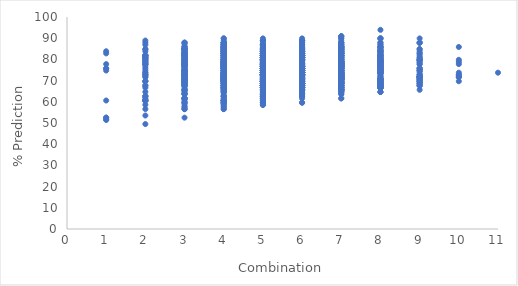
| Category | Series 0 |
|---|---|
| 1.0 | 82.828 |
| 1.0 | 77.778 |
| 1.0 | 75.758 |
| 1.0 | 52.525 |
| 1.0 | 52.525 |
| 1.0 | 51.515 |
| 1.0 | 51.515 |
| 1.0 | 75.758 |
| 1.0 | 60.606 |
| 1.0 | 74.747 |
| 1.0 | 83.838 |
| 2.0 | 80.808 |
| 2.0 | 79.798 |
| 2.0 | 78.788 |
| 2.0 | 77.778 |
| 2.0 | 74.747 |
| 2.0 | 72.727 |
| 2.0 | 69.697 |
| 2.0 | 67.677 |
| 2.0 | 62.626 |
| 2.0 | 60.606 |
| 2.0 | 83.838 |
| 2.0 | 73.737 |
| 2.0 | 66.667 |
| 2.0 | 60.606 |
| 2.0 | 49.495 |
| 2.0 | 79.798 |
| 2.0 | 76.768 |
| 2.0 | 62.626 |
| 2.0 | 56.566 |
| 2.0 | 60.606 |
| 2.0 | 60.606 |
| 2.0 | 88.889 |
| 2.0 | 78.788 |
| 2.0 | 81.818 |
| 2.0 | 77.778 |
| 2.0 | 71.717 |
| 2.0 | 69.697 |
| 2.0 | 75.758 |
| 2.0 | 69.697 |
| 2.0 | 71.717 |
| 2.0 | 64.646 |
| 2.0 | 60.606 |
| 2.0 | 53.535 |
| 2.0 | 58.586 |
| 2.0 | 61.616 |
| 2.0 | 67.677 |
| 2.0 | 80.808 |
| 2.0 | 81.818 |
| 2.0 | 78.788 |
| 2.0 | 80.808 |
| 2.0 | 72.727 |
| 2.0 | 77.778 |
| 2.0 | 77.778 |
| 2.0 | 80.808 |
| 2.0 | 73.737 |
| 2.0 | 86.869 |
| 2.0 | 84.848 |
| 2.0 | 84.848 |
| 2.0 | 81.818 |
| 2.0 | 72.727 |
| 2.0 | 87.879 |
| 2.0 | 81.818 |
| 2.0 | 79.798 |
| 2.0 | 62.626 |
| 2.0 | 81.818 |
| 3.0 | 78.788 |
| 3.0 | 77.778 |
| 3.0 | 79.798 |
| 3.0 | 77.778 |
| 3.0 | 71.717 |
| 3.0 | 69.697 |
| 3.0 | 67.677 |
| 3.0 | 61.616 |
| 3.0 | 61.616 |
| 3.0 | 66.667 |
| 3.0 | 84.848 |
| 3.0 | 77.778 |
| 3.0 | 77.778 |
| 3.0 | 72.727 |
| 3.0 | 67.677 |
| 3.0 | 70.707 |
| 3.0 | 56.566 |
| 3.0 | 57.576 |
| 3.0 | 61.616 |
| 3.0 | 52.525 |
| 3.0 | 84.848 |
| 3.0 | 72.727 |
| 3.0 | 83.838 |
| 3.0 | 73.737 |
| 3.0 | 75.758 |
| 3.0 | 71.717 |
| 3.0 | 68.687 |
| 3.0 | 70.707 |
| 3.0 | 67.677 |
| 3.0 | 56.566 |
| 3.0 | 73.737 |
| 3.0 | 72.727 |
| 3.0 | 68.687 |
| 3.0 | 64.646 |
| 3.0 | 61.616 |
| 3.0 | 82.828 |
| 3.0 | 87.879 |
| 3.0 | 76.768 |
| 3.0 | 74.747 |
| 3.0 | 69.697 |
| 3.0 | 71.717 |
| 3.0 | 72.727 |
| 3.0 | 73.737 |
| 3.0 | 72.727 |
| 3.0 | 70.707 |
| 3.0 | 68.687 |
| 3.0 | 69.697 |
| 3.0 | 70.707 |
| 3.0 | 69.697 |
| 3.0 | 70.707 |
| 3.0 | 77.778 |
| 3.0 | 77.778 |
| 3.0 | 78.788 |
| 3.0 | 70.707 |
| 3.0 | 65.657 |
| 3.0 | 70.707 |
| 3.0 | 77.778 |
| 3.0 | 60.606 |
| 3.0 | 76.768 |
| 3.0 | 72.727 |
| 3.0 | 69.697 |
| 3.0 | 68.687 |
| 3.0 | 59.596 |
| 3.0 | 61.616 |
| 3.0 | 59.596 |
| 3.0 | 58.586 |
| 3.0 | 72.727 |
| 3.0 | 69.697 |
| 3.0 | 67.677 |
| 3.0 | 59.596 |
| 3.0 | 56.566 |
| 3.0 | 65.657 |
| 3.0 | 63.636 |
| 3.0 | 64.646 |
| 3.0 | 72.727 |
| 3.0 | 63.636 |
| 3.0 | 72.727 |
| 3.0 | 75.758 |
| 3.0 | 69.697 |
| 3.0 | 75.758 |
| 3.0 | 76.768 |
| 3.0 | 73.737 |
| 3.0 | 72.727 |
| 3.0 | 74.747 |
| 3.0 | 83.838 |
| 3.0 | 80.808 |
| 3.0 | 81.818 |
| 3.0 | 82.828 |
| 3.0 | 81.818 |
| 3.0 | 80.808 |
| 3.0 | 78.788 |
| 3.0 | 78.788 |
| 3.0 | 74.747 |
| 3.0 | 65.657 |
| 3.0 | 85.859 |
| 3.0 | 79.798 |
| 3.0 | 77.778 |
| 3.0 | 71.717 |
| 3.0 | 57.576 |
| 3.0 | 84.848 |
| 3.0 | 84.848 |
| 3.0 | 79.798 |
| 3.0 | 78.788 |
| 3.0 | 72.727 |
| 3.0 | 74.747 |
| 3.0 | 82.828 |
| 3.0 | 79.798 |
| 3.0 | 81.818 |
| 3.0 | 76.768 |
| 3.0 | 76.768 |
| 3.0 | 73.737 |
| 3.0 | 80.808 |
| 3.0 | 79.798 |
| 3.0 | 84.848 |
| 3.0 | 68.687 |
| 3.0 | 71.717 |
| 3.0 | 63.636 |
| 3.0 | 67.677 |
| 3.0 | 65.657 |
| 3.0 | 76.768 |
| 3.0 | 84.848 |
| 3.0 | 85.859 |
| 3.0 | 82.828 |
| 3.0 | 84.848 |
| 3.0 | 83.838 |
| 3.0 | 79.798 |
| 3.0 | 78.788 |
| 3.0 | 82.828 |
| 3.0 | 68.687 |
| 3.0 | 63.636 |
| 3.0 | 86.869 |
| 3.0 | 87.879 |
| 3.0 | 82.828 |
| 3.0 | 74.747 |
| 3.0 | 63.636 |
| 3.0 | 85.859 |
| 3.0 | 87.879 |
| 3.0 | 84.848 |
| 3.0 | 81.818 |
| 3.0 | 72.727 |
| 3.0 | 76.768 |
| 3.0 | 81.818 |
| 3.0 | 80.808 |
| 3.0 | 80.808 |
| 3.0 | 77.778 |
| 3.0 | 73.737 |
| 3.0 | 70.707 |
| 3.0 | 78.788 |
| 3.0 | 73.737 |
| 3.0 | 84.848 |
| 3.0 | 65.657 |
| 3.0 | 74.747 |
| 3.0 | 71.717 |
| 3.0 | 77.778 |
| 3.0 | 74.747 |
| 3.0 | 72.727 |
| 3.0 | 84.848 |
| 3.0 | 84.848 |
| 3.0 | 85.859 |
| 3.0 | 83.838 |
| 3.0 | 82.828 |
| 3.0 | 81.818 |
| 3.0 | 81.818 |
| 3.0 | 79.798 |
| 3.0 | 79.798 |
| 4.0 | 82.828 |
| 4.0 | 65.657 |
| 4.0 | 66.667 |
| 4.0 | 66.667 |
| 4.0 | 66.667 |
| 4.0 | 79.798 |
| 4.0 | 68.687 |
| 4.0 | 72.727 |
| 4.0 | 69.697 |
| 4.0 | 63.636 |
| 4.0 | 66.667 |
| 4.0 | 65.657 |
| 4.0 | 59.596 |
| 4.0 | 57.576 |
| 4.0 | 61.616 |
| 4.0 | 85.859 |
| 4.0 | 77.778 |
| 4.0 | 74.747 |
| 4.0 | 74.747 |
| 4.0 | 75.758 |
| 4.0 | 69.697 |
| 4.0 | 73.737 |
| 4.0 | 59.596 |
| 4.0 | 62.626 |
| 4.0 | 56.566 |
| 4.0 | 79.798 |
| 4.0 | 75.758 |
| 4.0 | 73.737 |
| 4.0 | 76.768 |
| 4.0 | 70.707 |
| 4.0 | 73.737 |
| 4.0 | 73.737 |
| 4.0 | 71.717 |
| 4.0 | 74.747 |
| 4.0 | 56.566 |
| 4.0 | 85.859 |
| 4.0 | 70.707 |
| 4.0 | 71.717 |
| 4.0 | 67.677 |
| 4.0 | 73.737 |
| 4.0 | 74.747 |
| 4.0 | 71.717 |
| 4.0 | 70.707 |
| 4.0 | 68.687 |
| 4.0 | 69.697 |
| 4.0 | 68.687 |
| 4.0 | 71.717 |
| 4.0 | 69.697 |
| 4.0 | 69.697 |
| 4.0 | 67.677 |
| 4.0 | 71.717 |
| 4.0 | 70.707 |
| 4.0 | 68.687 |
| 4.0 | 72.727 |
| 4.0 | 67.677 |
| 4.0 | 76.768 |
| 4.0 | 80.808 |
| 4.0 | 78.788 |
| 4.0 | 67.677 |
| 4.0 | 69.697 |
| 4.0 | 69.697 |
| 4.0 | 69.697 |
| 4.0 | 71.717 |
| 4.0 | 65.657 |
| 4.0 | 66.667 |
| 4.0 | 68.687 |
| 4.0 | 67.677 |
| 4.0 | 70.707 |
| 4.0 | 67.677 |
| 4.0 | 70.707 |
| 4.0 | 81.818 |
| 4.0 | 71.717 |
| 4.0 | 74.747 |
| 4.0 | 70.707 |
| 4.0 | 71.717 |
| 4.0 | 64.646 |
| 4.0 | 67.677 |
| 4.0 | 60.606 |
| 4.0 | 60.606 |
| 4.0 | 58.586 |
| 4.0 | 76.768 |
| 4.0 | 71.717 |
| 4.0 | 72.727 |
| 4.0 | 60.606 |
| 4.0 | 60.606 |
| 4.0 | 60.606 |
| 4.0 | 59.596 |
| 4.0 | 59.596 |
| 4.0 | 60.606 |
| 4.0 | 60.606 |
| 4.0 | 72.727 |
| 4.0 | 68.687 |
| 4.0 | 70.707 |
| 4.0 | 76.768 |
| 4.0 | 76.768 |
| 4.0 | 78.788 |
| 4.0 | 69.697 |
| 4.0 | 71.717 |
| 4.0 | 69.697 |
| 4.0 | 60.606 |
| 4.0 | 73.737 |
| 4.0 | 74.747 |
| 4.0 | 72.727 |
| 4.0 | 62.626 |
| 4.0 | 62.626 |
| 4.0 | 73.737 |
| 4.0 | 75.758 |
| 4.0 | 71.717 |
| 4.0 | 75.758 |
| 4.0 | 72.727 |
| 4.0 | 72.727 |
| 4.0 | 73.737 |
| 4.0 | 75.758 |
| 4.0 | 77.778 |
| 4.0 | 73.737 |
| 4.0 | 70.707 |
| 4.0 | 69.697 |
| 4.0 | 70.707 |
| 4.0 | 71.717 |
| 4.0 | 69.697 |
| 4.0 | 77.778 |
| 4.0 | 75.758 |
| 4.0 | 79.798 |
| 4.0 | 71.717 |
| 4.0 | 75.758 |
| 4.0 | 69.697 |
| 4.0 | 80.808 |
| 4.0 | 84.848 |
| 4.0 | 85.859 |
| 4.0 | 82.828 |
| 4.0 | 83.838 |
| 4.0 | 79.798 |
| 4.0 | 77.778 |
| 4.0 | 71.717 |
| 4.0 | 68.687 |
| 4.0 | 69.697 |
| 4.0 | 89.899 |
| 4.0 | 86.869 |
| 4.0 | 85.859 |
| 4.0 | 78.788 |
| 4.0 | 68.687 |
| 4.0 | 74.747 |
| 4.0 | 70.707 |
| 4.0 | 64.646 |
| 4.0 | 69.697 |
| 4.0 | 57.576 |
| 4.0 | 87.879 |
| 4.0 | 85.859 |
| 4.0 | 86.869 |
| 4.0 | 80.808 |
| 4.0 | 83.838 |
| 4.0 | 77.778 |
| 4.0 | 75.758 |
| 4.0 | 75.758 |
| 4.0 | 73.737 |
| 4.0 | 69.697 |
| 4.0 | 83.838 |
| 4.0 | 81.818 |
| 4.0 | 81.818 |
| 4.0 | 77.778 |
| 4.0 | 64.646 |
| 4.0 | 84.848 |
| 4.0 | 83.838 |
| 4.0 | 79.798 |
| 4.0 | 75.758 |
| 4.0 | 72.727 |
| 4.0 | 77.778 |
| 4.0 | 75.758 |
| 4.0 | 76.768 |
| 4.0 | 77.778 |
| 4.0 | 75.758 |
| 4.0 | 74.747 |
| 4.0 | 72.727 |
| 4.0 | 73.737 |
| 4.0 | 76.768 |
| 4.0 | 70.707 |
| 4.0 | 81.818 |
| 4.0 | 79.798 |
| 4.0 | 80.808 |
| 4.0 | 71.717 |
| 4.0 | 77.778 |
| 4.0 | 70.707 |
| 4.0 | 84.848 |
| 4.0 | 81.818 |
| 4.0 | 82.828 |
| 4.0 | 78.788 |
| 4.0 | 75.758 |
| 4.0 | 76.768 |
| 4.0 | 71.717 |
| 4.0 | 74.747 |
| 4.0 | 68.687 |
| 4.0 | 60.606 |
| 4.0 | 75.758 |
| 4.0 | 73.737 |
| 4.0 | 70.707 |
| 4.0 | 59.596 |
| 4.0 | 64.646 |
| 4.0 | 71.717 |
| 4.0 | 73.737 |
| 4.0 | 69.697 |
| 4.0 | 76.768 |
| 4.0 | 66.667 |
| 4.0 | 73.737 |
| 4.0 | 76.768 |
| 4.0 | 76.768 |
| 4.0 | 79.798 |
| 4.0 | 75.758 |
| 4.0 | 77.778 |
| 4.0 | 74.747 |
| 4.0 | 79.798 |
| 4.0 | 86.869 |
| 4.0 | 84.848 |
| 4.0 | 80.808 |
| 4.0 | 80.808 |
| 4.0 | 84.848 |
| 4.0 | 73.737 |
| 4.0 | 75.758 |
| 4.0 | 61.616 |
| 4.0 | 67.677 |
| 4.0 | 66.667 |
| 4.0 | 88.889 |
| 4.0 | 82.828 |
| 4.0 | 85.859 |
| 4.0 | 78.788 |
| 4.0 | 74.747 |
| 4.0 | 73.737 |
| 4.0 | 70.707 |
| 4.0 | 72.727 |
| 4.0 | 66.667 |
| 4.0 | 62.626 |
| 4.0 | 87.879 |
| 4.0 | 83.838 |
| 4.0 | 87.879 |
| 4.0 | 81.818 |
| 4.0 | 83.838 |
| 4.0 | 78.788 |
| 4.0 | 75.758 |
| 4.0 | 78.788 |
| 4.0 | 71.717 |
| 4.0 | 66.667 |
| 4.0 | 87.879 |
| 4.0 | 87.879 |
| 4.0 | 77.778 |
| 4.0 | 72.727 |
| 4.0 | 73.737 |
| 4.0 | 86.869 |
| 4.0 | 81.818 |
| 4.0 | 81.818 |
| 4.0 | 76.768 |
| 4.0 | 76.768 |
| 4.0 | 75.758 |
| 4.0 | 71.717 |
| 4.0 | 69.697 |
| 4.0 | 72.727 |
| 4.0 | 71.717 |
| 4.0 | 67.677 |
| 4.0 | 65.657 |
| 4.0 | 70.707 |
| 4.0 | 75.758 |
| 4.0 | 70.707 |
| 4.0 | 78.788 |
| 4.0 | 76.768 |
| 4.0 | 78.788 |
| 4.0 | 70.707 |
| 4.0 | 80.808 |
| 4.0 | 68.687 |
| 4.0 | 85.859 |
| 4.0 | 72.727 |
| 4.0 | 83.838 |
| 4.0 | 75.758 |
| 4.0 | 72.727 |
| 4.0 | 76.768 |
| 4.0 | 71.717 |
| 4.0 | 77.778 |
| 4.0 | 71.717 |
| 4.0 | 58.586 |
| 4.0 | 83.838 |
| 4.0 | 82.828 |
| 4.0 | 78.788 |
| 4.0 | 59.596 |
| 4.0 | 65.657 |
| 4.0 | 75.758 |
| 4.0 | 78.788 |
| 4.0 | 77.778 |
| 4.0 | 81.818 |
| 4.0 | 75.758 |
| 4.0 | 85.859 |
| 4.0 | 78.788 |
| 4.0 | 82.828 |
| 4.0 | 77.778 |
| 4.0 | 74.747 |
| 4.0 | 78.788 |
| 4.0 | 66.667 |
| 4.0 | 83.838 |
| 4.0 | 86.869 |
| 4.0 | 86.869 |
| 4.0 | 85.859 |
| 4.0 | 83.838 |
| 4.0 | 82.828 |
| 4.0 | 81.818 |
| 4.0 | 84.848 |
| 4.0 | 86.869 |
| 4.0 | 82.828 |
| 4.0 | 69.697 |
| 4.0 | 87.879 |
| 4.0 | 87.879 |
| 4.0 | 84.848 |
| 4.0 | 78.788 |
| 4.0 | 67.677 |
| 4.0 | 85.859 |
| 4.0 | 89.899 |
| 4.0 | 82.828 |
| 4.0 | 84.848 |
| 4.0 | 79.798 |
| 4.0 | 82.828 |
| 4.0 | 81.818 |
| 4.0 | 78.788 |
| 4.0 | 82.828 |
| 4.0 | 80.808 |
| 4.0 | 78.788 |
| 4.0 | 72.727 |
| 4.0 | 79.798 |
| 4.0 | 84.848 |
| 4.0 | 82.828 |
| 4.0 | 79.798 |
| 4.0 | 77.778 |
| 4.0 | 77.778 |
| 4.0 | 85.859 |
| 4.0 | 75.758 |
| 4.0 | 81.818 |
| 5.0 | 67.677 |
| 5.0 | 72.727 |
| 5.0 | 76.768 |
| 5.0 | 62.626 |
| 5.0 | 63.636 |
| 5.0 | 61.616 |
| 5.0 | 78.788 |
| 5.0 | 73.737 |
| 5.0 | 65.657 |
| 5.0 | 61.616 |
| 5.0 | 65.657 |
| 5.0 | 77.778 |
| 5.0 | 78.788 |
| 5.0 | 79.798 |
| 5.0 | 77.778 |
| 5.0 | 75.758 |
| 5.0 | 75.758 |
| 5.0 | 77.778 |
| 5.0 | 67.677 |
| 5.0 | 66.667 |
| 5.0 | 64.646 |
| 5.0 | 69.697 |
| 5.0 | 74.747 |
| 5.0 | 69.697 |
| 5.0 | 71.717 |
| 5.0 | 70.707 |
| 5.0 | 72.727 |
| 5.0 | 67.677 |
| 5.0 | 70.707 |
| 5.0 | 68.687 |
| 5.0 | 69.697 |
| 5.0 | 70.707 |
| 5.0 | 67.677 |
| 5.0 | 65.657 |
| 5.0 | 66.667 |
| 5.0 | 68.687 |
| 5.0 | 79.798 |
| 5.0 | 67.677 |
| 5.0 | 69.697 |
| 5.0 | 68.687 |
| 5.0 | 77.778 |
| 5.0 | 75.758 |
| 5.0 | 74.747 |
| 5.0 | 66.667 |
| 5.0 | 63.636 |
| 5.0 | 67.677 |
| 5.0 | 67.677 |
| 5.0 | 72.727 |
| 5.0 | 68.687 |
| 5.0 | 62.626 |
| 5.0 | 66.667 |
| 5.0 | 67.677 |
| 5.0 | 72.727 |
| 5.0 | 67.677 |
| 5.0 | 72.727 |
| 5.0 | 65.657 |
| 5.0 | 74.747 |
| 5.0 | 71.717 |
| 5.0 | 60.606 |
| 5.0 | 59.596 |
| 5.0 | 58.586 |
| 5.0 | 75.758 |
| 5.0 | 62.626 |
| 5.0 | 61.616 |
| 5.0 | 60.606 |
| 5.0 | 67.677 |
| 5.0 | 64.646 |
| 5.0 | 67.677 |
| 5.0 | 61.616 |
| 5.0 | 63.636 |
| 5.0 | 59.596 |
| 5.0 | 74.747 |
| 5.0 | 77.778 |
| 5.0 | 77.778 |
| 5.0 | 77.778 |
| 5.0 | 73.737 |
| 5.0 | 71.717 |
| 5.0 | 73.737 |
| 5.0 | 60.606 |
| 5.0 | 61.616 |
| 5.0 | 61.616 |
| 5.0 | 76.768 |
| 5.0 | 77.778 |
| 5.0 | 73.737 |
| 5.0 | 64.646 |
| 5.0 | 64.646 |
| 5.0 | 67.677 |
| 5.0 | 69.697 |
| 5.0 | 70.707 |
| 5.0 | 66.667 |
| 5.0 | 63.636 |
| 5.0 | 74.747 |
| 5.0 | 72.727 |
| 5.0 | 72.727 |
| 5.0 | 69.697 |
| 5.0 | 73.737 |
| 5.0 | 79.798 |
| 5.0 | 77.778 |
| 5.0 | 72.727 |
| 5.0 | 72.727 |
| 5.0 | 72.727 |
| 5.0 | 66.667 |
| 5.0 | 69.697 |
| 5.0 | 71.717 |
| 5.0 | 69.697 |
| 5.0 | 70.707 |
| 5.0 | 69.697 |
| 5.0 | 67.677 |
| 5.0 | 67.677 |
| 5.0 | 69.697 |
| 5.0 | 73.737 |
| 5.0 | 76.768 |
| 5.0 | 79.798 |
| 5.0 | 75.758 |
| 5.0 | 70.707 |
| 5.0 | 68.687 |
| 5.0 | 69.697 |
| 5.0 | 80.808 |
| 5.0 | 76.768 |
| 5.0 | 78.788 |
| 5.0 | 71.717 |
| 5.0 | 73.737 |
| 5.0 | 68.687 |
| 5.0 | 72.727 |
| 5.0 | 69.697 |
| 5.0 | 68.687 |
| 5.0 | 85.859 |
| 5.0 | 79.798 |
| 5.0 | 69.697 |
| 5.0 | 68.687 |
| 5.0 | 71.717 |
| 5.0 | 86.869 |
| 5.0 | 76.768 |
| 5.0 | 79.798 |
| 5.0 | 68.687 |
| 5.0 | 75.758 |
| 5.0 | 72.727 |
| 5.0 | 73.737 |
| 5.0 | 63.636 |
| 5.0 | 63.636 |
| 5.0 | 60.606 |
| 5.0 | 86.869 |
| 5.0 | 83.838 |
| 5.0 | 78.788 |
| 5.0 | 78.788 |
| 5.0 | 75.758 |
| 5.0 | 75.758 |
| 5.0 | 74.747 |
| 5.0 | 72.727 |
| 5.0 | 71.717 |
| 5.0 | 74.747 |
| 5.0 | 86.869 |
| 5.0 | 85.859 |
| 5.0 | 85.859 |
| 5.0 | 81.818 |
| 5.0 | 77.778 |
| 5.0 | 79.798 |
| 5.0 | 72.727 |
| 5.0 | 71.717 |
| 5.0 | 72.727 |
| 5.0 | 64.646 |
| 5.0 | 85.859 |
| 5.0 | 73.737 |
| 5.0 | 77.778 |
| 5.0 | 72.727 |
| 5.0 | 75.758 |
| 5.0 | 78.788 |
| 5.0 | 78.788 |
| 5.0 | 71.717 |
| 5.0 | 72.727 |
| 5.0 | 71.717 |
| 5.0 | 72.727 |
| 5.0 | 77.778 |
| 5.0 | 73.737 |
| 5.0 | 76.768 |
| 5.0 | 74.747 |
| 5.0 | 79.798 |
| 5.0 | 72.727 |
| 5.0 | 70.707 |
| 5.0 | 72.727 |
| 5.0 | 72.727 |
| 5.0 | 79.798 |
| 5.0 | 82.828 |
| 5.0 | 78.788 |
| 5.0 | 71.717 |
| 5.0 | 69.697 |
| 5.0 | 75.758 |
| 5.0 | 79.798 |
| 5.0 | 76.768 |
| 5.0 | 80.808 |
| 5.0 | 71.717 |
| 5.0 | 71.717 |
| 5.0 | 68.687 |
| 5.0 | 71.717 |
| 5.0 | 67.677 |
| 5.0 | 71.717 |
| 5.0 | 85.859 |
| 5.0 | 77.778 |
| 5.0 | 78.788 |
| 5.0 | 79.798 |
| 5.0 | 82.828 |
| 5.0 | 70.707 |
| 5.0 | 73.737 |
| 5.0 | 59.596 |
| 5.0 | 63.636 |
| 5.0 | 58.586 |
| 5.0 | 84.848 |
| 5.0 | 76.768 |
| 5.0 | 76.768 |
| 5.0 | 64.646 |
| 5.0 | 62.626 |
| 5.0 | 62.626 |
| 5.0 | 63.636 |
| 5.0 | 69.697 |
| 5.0 | 66.667 |
| 5.0 | 63.636 |
| 5.0 | 83.838 |
| 5.0 | 74.747 |
| 5.0 | 78.788 |
| 5.0 | 77.778 |
| 5.0 | 76.768 |
| 5.0 | 78.788 |
| 5.0 | 73.737 |
| 5.0 | 72.727 |
| 5.0 | 72.727 |
| 5.0 | 63.636 |
| 5.0 | 78.788 |
| 5.0 | 77.778 |
| 5.0 | 77.778 |
| 5.0 | 68.687 |
| 5.0 | 69.697 |
| 5.0 | 77.778 |
| 5.0 | 79.798 |
| 5.0 | 79.798 |
| 5.0 | 74.747 |
| 5.0 | 72.727 |
| 5.0 | 74.747 |
| 5.0 | 79.798 |
| 5.0 | 80.808 |
| 5.0 | 81.818 |
| 5.0 | 77.778 |
| 5.0 | 72.727 |
| 5.0 | 69.697 |
| 5.0 | 69.697 |
| 5.0 | 71.717 |
| 5.0 | 70.707 |
| 5.0 | 80.808 |
| 5.0 | 78.788 |
| 5.0 | 80.808 |
| 5.0 | 71.717 |
| 5.0 | 79.798 |
| 5.0 | 72.727 |
| 5.0 | 84.848 |
| 5.0 | 76.768 |
| 5.0 | 67.677 |
| 5.0 | 67.677 |
| 5.0 | 66.667 |
| 5.0 | 85.859 |
| 5.0 | 78.788 |
| 5.0 | 75.758 |
| 5.0 | 70.707 |
| 5.0 | 76.768 |
| 5.0 | 72.727 |
| 5.0 | 74.747 |
| 5.0 | 63.636 |
| 5.0 | 65.657 |
| 5.0 | 67.677 |
| 5.0 | 88.889 |
| 5.0 | 82.828 |
| 5.0 | 79.798 |
| 5.0 | 81.818 |
| 5.0 | 79.798 |
| 5.0 | 76.768 |
| 5.0 | 78.788 |
| 5.0 | 69.697 |
| 5.0 | 69.697 |
| 5.0 | 70.707 |
| 5.0 | 88.889 |
| 5.0 | 84.848 |
| 5.0 | 83.838 |
| 5.0 | 78.788 |
| 5.0 | 78.788 |
| 5.0 | 73.737 |
| 5.0 | 78.788 |
| 5.0 | 82.828 |
| 5.0 | 79.798 |
| 5.0 | 69.697 |
| 5.0 | 84.848 |
| 5.0 | 75.758 |
| 5.0 | 78.788 |
| 5.0 | 76.768 |
| 5.0 | 73.737 |
| 5.0 | 76.768 |
| 5.0 | 74.747 |
| 5.0 | 74.747 |
| 5.0 | 74.747 |
| 5.0 | 72.727 |
| 5.0 | 65.657 |
| 5.0 | 70.707 |
| 5.0 | 66.667 |
| 5.0 | 73.737 |
| 5.0 | 71.717 |
| 5.0 | 72.727 |
| 5.0 | 71.717 |
| 5.0 | 70.707 |
| 5.0 | 70.707 |
| 5.0 | 66.667 |
| 5.0 | 78.788 |
| 5.0 | 80.808 |
| 5.0 | 76.768 |
| 5.0 | 76.768 |
| 5.0 | 72.727 |
| 5.0 | 71.717 |
| 5.0 | 80.808 |
| 5.0 | 77.778 |
| 5.0 | 79.798 |
| 5.0 | 71.717 |
| 5.0 | 66.667 |
| 5.0 | 67.677 |
| 5.0 | 67.677 |
| 5.0 | 66.667 |
| 5.0 | 70.707 |
| 5.0 | 84.848 |
| 5.0 | 73.737 |
| 5.0 | 77.778 |
| 5.0 | 75.758 |
| 5.0 | 81.818 |
| 5.0 | 73.737 |
| 5.0 | 76.768 |
| 5.0 | 59.596 |
| 5.0 | 62.626 |
| 5.0 | 58.586 |
| 5.0 | 86.869 |
| 5.0 | 80.808 |
| 5.0 | 84.848 |
| 5.0 | 63.636 |
| 5.0 | 63.636 |
| 5.0 | 64.646 |
| 5.0 | 71.717 |
| 5.0 | 72.727 |
| 5.0 | 69.697 |
| 5.0 | 62.626 |
| 5.0 | 82.828 |
| 5.0 | 75.758 |
| 5.0 | 81.818 |
| 5.0 | 81.818 |
| 5.0 | 80.808 |
| 5.0 | 80.808 |
| 5.0 | 81.818 |
| 5.0 | 84.848 |
| 5.0 | 79.798 |
| 5.0 | 62.626 |
| 5.0 | 86.869 |
| 5.0 | 86.869 |
| 5.0 | 86.869 |
| 5.0 | 67.677 |
| 5.0 | 72.727 |
| 5.0 | 82.828 |
| 5.0 | 79.798 |
| 5.0 | 82.828 |
| 5.0 | 73.737 |
| 5.0 | 72.727 |
| 5.0 | 73.737 |
| 5.0 | 80.808 |
| 5.0 | 80.808 |
| 5.0 | 79.798 |
| 5.0 | 71.717 |
| 5.0 | 67.677 |
| 5.0 | 66.667 |
| 5.0 | 70.707 |
| 5.0 | 69.697 |
| 5.0 | 67.677 |
| 5.0 | 84.848 |
| 5.0 | 83.838 |
| 5.0 | 83.838 |
| 5.0 | 71.717 |
| 5.0 | 83.838 |
| 5.0 | 70.707 |
| 5.0 | 83.838 |
| 5.0 | 83.838 |
| 5.0 | 82.828 |
| 5.0 | 82.828 |
| 5.0 | 84.848 |
| 5.0 | 82.828 |
| 5.0 | 81.818 |
| 5.0 | 70.707 |
| 5.0 | 71.717 |
| 5.0 | 68.687 |
| 5.0 | 88.889 |
| 5.0 | 86.869 |
| 5.0 | 85.859 |
| 5.0 | 75.758 |
| 5.0 | 77.778 |
| 5.0 | 74.747 |
| 5.0 | 75.758 |
| 5.0 | 78.788 |
| 5.0 | 74.747 |
| 5.0 | 65.657 |
| 5.0 | 86.869 |
| 5.0 | 84.848 |
| 5.0 | 85.859 |
| 5.0 | 83.838 |
| 5.0 | 85.859 |
| 5.0 | 80.808 |
| 5.0 | 81.818 |
| 5.0 | 83.838 |
| 5.0 | 80.808 |
| 5.0 | 75.758 |
| 5.0 | 89.899 |
| 5.0 | 87.879 |
| 5.0 | 86.869 |
| 5.0 | 78.788 |
| 5.0 | 77.778 |
| 5.0 | 83.838 |
| 5.0 | 85.859 |
| 5.0 | 84.848 |
| 5.0 | 78.788 |
| 5.0 | 78.788 |
| 5.0 | 76.768 |
| 5.0 | 82.828 |
| 5.0 | 79.798 |
| 5.0 | 81.818 |
| 5.0 | 75.758 |
| 5.0 | 72.727 |
| 5.0 | 71.717 |
| 5.0 | 70.707 |
| 5.0 | 75.758 |
| 5.0 | 71.717 |
| 5.0 | 81.818 |
| 5.0 | 79.798 |
| 5.0 | 81.818 |
| 5.0 | 75.758 |
| 5.0 | 79.798 |
| 5.0 | 72.727 |
| 5.0 | 85.859 |
| 5.0 | 83.838 |
| 5.0 | 84.848 |
| 5.0 | 77.778 |
| 5.0 | 75.758 |
| 5.0 | 77.778 |
| 5.0 | 77.778 |
| 5.0 | 81.818 |
| 5.0 | 74.747 |
| 5.0 | 62.626 |
| 5.0 | 84.848 |
| 5.0 | 88.889 |
| 5.0 | 82.828 |
| 5.0 | 66.667 |
| 5.0 | 73.737 |
| 5.0 | 78.788 |
| 5.0 | 82.828 |
| 5.0 | 78.788 |
| 5.0 | 79.798 |
| 5.0 | 78.788 |
| 5.0 | 84.848 |
| 5.0 | 81.818 |
| 5.0 | 81.818 |
| 5.0 | 83.838 |
| 5.0 | 77.778 |
| 5.0 | 82.828 |
| 5.0 | 68.687 |
| 5.0 | 82.828 |
| 6.0 | 67.677 |
| 6.0 | 66.667 |
| 6.0 | 82.828 |
| 6.0 | 79.798 |
| 6.0 | 74.747 |
| 6.0 | 70.707 |
| 6.0 | 70.707 |
| 6.0 | 70.707 |
| 6.0 | 68.687 |
| 6.0 | 70.707 |
| 6.0 | 68.687 |
| 6.0 | 68.687 |
| 6.0 | 69.697 |
| 6.0 | 67.677 |
| 6.0 | 80.808 |
| 6.0 | 64.646 |
| 6.0 | 67.677 |
| 6.0 | 65.657 |
| 6.0 | 71.717 |
| 6.0 | 64.646 |
| 6.0 | 66.667 |
| 6.0 | 64.646 |
| 6.0 | 70.707 |
| 6.0 | 70.707 |
| 6.0 | 70.707 |
| 6.0 | 65.657 |
| 6.0 | 62.626 |
| 6.0 | 66.667 |
| 6.0 | 59.596 |
| 6.0 | 63.636 |
| 6.0 | 73.737 |
| 6.0 | 61.616 |
| 6.0 | 64.646 |
| 6.0 | 63.636 |
| 6.0 | 78.788 |
| 6.0 | 74.747 |
| 6.0 | 65.657 |
| 6.0 | 65.657 |
| 6.0 | 65.657 |
| 6.0 | 79.798 |
| 6.0 | 70.707 |
| 6.0 | 67.677 |
| 6.0 | 69.697 |
| 6.0 | 79.798 |
| 6.0 | 76.768 |
| 6.0 | 75.758 |
| 6.0 | 68.687 |
| 6.0 | 68.687 |
| 6.0 | 69.697 |
| 6.0 | 71.717 |
| 6.0 | 79.798 |
| 6.0 | 72.727 |
| 6.0 | 73.737 |
| 6.0 | 70.707 |
| 6.0 | 73.737 |
| 6.0 | 70.707 |
| 6.0 | 72.727 |
| 6.0 | 72.727 |
| 6.0 | 68.687 |
| 6.0 | 71.717 |
| 6.0 | 69.697 |
| 6.0 | 69.697 |
| 6.0 | 68.687 |
| 6.0 | 71.717 |
| 6.0 | 77.778 |
| 6.0 | 68.687 |
| 6.0 | 70.707 |
| 6.0 | 68.687 |
| 6.0 | 78.788 |
| 6.0 | 80.808 |
| 6.0 | 78.788 |
| 6.0 | 67.677 |
| 6.0 | 69.697 |
| 6.0 | 72.727 |
| 6.0 | 72.727 |
| 6.0 | 75.758 |
| 6.0 | 73.737 |
| 6.0 | 66.667 |
| 6.0 | 65.657 |
| 6.0 | 66.667 |
| 6.0 | 70.707 |
| 6.0 | 69.697 |
| 6.0 | 71.717 |
| 6.0 | 66.667 |
| 6.0 | 72.727 |
| 6.0 | 76.768 |
| 6.0 | 77.778 |
| 6.0 | 72.727 |
| 6.0 | 71.717 |
| 6.0 | 67.677 |
| 6.0 | 80.808 |
| 6.0 | 76.768 |
| 6.0 | 76.768 |
| 6.0 | 76.768 |
| 6.0 | 72.727 |
| 6.0 | 84.848 |
| 6.0 | 83.838 |
| 6.0 | 82.828 |
| 6.0 | 80.808 |
| 6.0 | 80.808 |
| 6.0 | 75.758 |
| 6.0 | 79.798 |
| 6.0 | 75.758 |
| 6.0 | 72.727 |
| 6.0 | 68.687 |
| 6.0 | 71.717 |
| 6.0 | 81.818 |
| 6.0 | 71.717 |
| 6.0 | 74.747 |
| 6.0 | 70.707 |
| 6.0 | 73.737 |
| 6.0 | 75.758 |
| 6.0 | 75.758 |
| 6.0 | 76.768 |
| 6.0 | 73.737 |
| 6.0 | 75.758 |
| 6.0 | 72.727 |
| 6.0 | 69.697 |
| 6.0 | 72.727 |
| 6.0 | 73.737 |
| 6.0 | 81.818 |
| 6.0 | 72.727 |
| 6.0 | 73.737 |
| 6.0 | 71.717 |
| 6.0 | 78.788 |
| 6.0 | 81.818 |
| 6.0 | 80.808 |
| 6.0 | 72.727 |
| 6.0 | 73.737 |
| 6.0 | 72.727 |
| 6.0 | 70.707 |
| 6.0 | 71.717 |
| 6.0 | 72.727 |
| 6.0 | 67.677 |
| 6.0 | 69.697 |
| 6.0 | 67.677 |
| 6.0 | 73.737 |
| 6.0 | 71.717 |
| 6.0 | 73.737 |
| 6.0 | 66.667 |
| 6.0 | 80.808 |
| 6.0 | 76.768 |
| 6.0 | 63.636 |
| 6.0 | 59.596 |
| 6.0 | 62.626 |
| 6.0 | 80.808 |
| 6.0 | 66.667 |
| 6.0 | 68.687 |
| 6.0 | 68.687 |
| 6.0 | 75.758 |
| 6.0 | 74.747 |
| 6.0 | 74.747 |
| 6.0 | 66.667 |
| 6.0 | 66.667 |
| 6.0 | 66.667 |
| 6.0 | 81.818 |
| 6.0 | 78.788 |
| 6.0 | 78.788 |
| 6.0 | 77.778 |
| 6.0 | 77.778 |
| 6.0 | 75.758 |
| 6.0 | 73.737 |
| 6.0 | 66.667 |
| 6.0 | 65.657 |
| 6.0 | 66.667 |
| 6.0 | 83.838 |
| 6.0 | 79.798 |
| 6.0 | 80.808 |
| 6.0 | 71.717 |
| 6.0 | 71.717 |
| 6.0 | 68.687 |
| 6.0 | 75.758 |
| 6.0 | 77.778 |
| 6.0 | 73.737 |
| 6.0 | 70.707 |
| 6.0 | 81.818 |
| 6.0 | 73.737 |
| 6.0 | 73.737 |
| 6.0 | 72.727 |
| 6.0 | 79.798 |
| 6.0 | 80.808 |
| 6.0 | 79.798 |
| 6.0 | 75.758 |
| 6.0 | 77.778 |
| 6.0 | 75.758 |
| 6.0 | 72.727 |
| 6.0 | 74.747 |
| 6.0 | 70.707 |
| 6.0 | 71.717 |
| 6.0 | 71.717 |
| 6.0 | 72.727 |
| 6.0 | 70.707 |
| 6.0 | 69.697 |
| 6.0 | 72.727 |
| 6.0 | 70.707 |
| 6.0 | 79.798 |
| 6.0 | 80.808 |
| 6.0 | 80.808 |
| 6.0 | 69.697 |
| 6.0 | 68.687 |
| 6.0 | 70.707 |
| 6.0 | 81.818 |
| 6.0 | 78.788 |
| 6.0 | 78.788 |
| 6.0 | 70.707 |
| 6.0 | 76.768 |
| 6.0 | 74.747 |
| 6.0 | 75.758 |
| 6.0 | 67.677 |
| 6.0 | 74.747 |
| 6.0 | 68.687 |
| 6.0 | 77.778 |
| 6.0 | 76.768 |
| 6.0 | 72.727 |
| 6.0 | 68.687 |
| 6.0 | 71.717 |
| 6.0 | 81.818 |
| 6.0 | 77.778 |
| 6.0 | 75.758 |
| 6.0 | 72.727 |
| 6.0 | 68.687 |
| 6.0 | 86.869 |
| 6.0 | 84.848 |
| 6.0 | 77.778 |
| 6.0 | 80.808 |
| 6.0 | 88.889 |
| 6.0 | 80.808 |
| 6.0 | 83.838 |
| 6.0 | 75.758 |
| 6.0 | 76.768 |
| 6.0 | 70.707 |
| 6.0 | 75.758 |
| 6.0 | 79.798 |
| 6.0 | 71.717 |
| 6.0 | 73.737 |
| 6.0 | 72.727 |
| 6.0 | 70.707 |
| 6.0 | 68.687 |
| 6.0 | 75.758 |
| 6.0 | 71.717 |
| 6.0 | 71.717 |
| 6.0 | 70.707 |
| 6.0 | 71.717 |
| 6.0 | 66.667 |
| 6.0 | 64.646 |
| 6.0 | 68.687 |
| 6.0 | 80.808 |
| 6.0 | 74.747 |
| 6.0 | 72.727 |
| 6.0 | 71.717 |
| 6.0 | 82.828 |
| 6.0 | 81.818 |
| 6.0 | 77.778 |
| 6.0 | 73.737 |
| 6.0 | 73.737 |
| 6.0 | 74.747 |
| 6.0 | 70.707 |
| 6.0 | 71.717 |
| 6.0 | 67.677 |
| 6.0 | 68.687 |
| 6.0 | 63.636 |
| 6.0 | 68.687 |
| 6.0 | 73.737 |
| 6.0 | 72.727 |
| 6.0 | 71.717 |
| 6.0 | 65.657 |
| 6.0 | 75.758 |
| 6.0 | 75.758 |
| 6.0 | 63.636 |
| 6.0 | 62.626 |
| 6.0 | 63.636 |
| 6.0 | 83.838 |
| 6.0 | 65.657 |
| 6.0 | 66.667 |
| 6.0 | 67.677 |
| 6.0 | 76.768 |
| 6.0 | 72.727 |
| 6.0 | 77.778 |
| 6.0 | 65.657 |
| 6.0 | 63.636 |
| 6.0 | 65.657 |
| 6.0 | 82.828 |
| 6.0 | 80.808 |
| 6.0 | 80.808 |
| 6.0 | 79.798 |
| 6.0 | 86.869 |
| 6.0 | 79.798 |
| 6.0 | 82.828 |
| 6.0 | 66.667 |
| 6.0 | 67.677 |
| 6.0 | 66.667 |
| 6.0 | 87.879 |
| 6.0 | 85.859 |
| 6.0 | 87.879 |
| 6.0 | 70.707 |
| 6.0 | 73.737 |
| 6.0 | 71.717 |
| 6.0 | 77.778 |
| 6.0 | 85.859 |
| 6.0 | 76.768 |
| 6.0 | 68.687 |
| 6.0 | 85.859 |
| 6.0 | 70.707 |
| 6.0 | 73.737 |
| 6.0 | 72.727 |
| 6.0 | 85.859 |
| 6.0 | 82.828 |
| 6.0 | 84.848 |
| 6.0 | 71.717 |
| 6.0 | 72.727 |
| 6.0 | 72.727 |
| 6.0 | 70.707 |
| 6.0 | 72.727 |
| 6.0 | 72.727 |
| 6.0 | 67.677 |
| 6.0 | 69.697 |
| 6.0 | 70.707 |
| 6.0 | 69.697 |
| 6.0 | 69.697 |
| 6.0 | 72.727 |
| 6.0 | 68.687 |
| 6.0 | 84.848 |
| 6.0 | 86.869 |
| 6.0 | 82.828 |
| 6.0 | 71.717 |
| 6.0 | 70.707 |
| 6.0 | 72.727 |
| 6.0 | 85.859 |
| 6.0 | 83.838 |
| 6.0 | 82.828 |
| 6.0 | 72.727 |
| 6.0 | 73.737 |
| 6.0 | 72.727 |
| 6.0 | 74.747 |
| 6.0 | 65.657 |
| 6.0 | 71.717 |
| 6.0 | 83.838 |
| 6.0 | 82.828 |
| 6.0 | 76.768 |
| 6.0 | 72.727 |
| 6.0 | 73.737 |
| 6.0 | 85.859 |
| 6.0 | 81.818 |
| 6.0 | 79.798 |
| 6.0 | 77.778 |
| 6.0 | 85.859 |
| 6.0 | 77.778 |
| 6.0 | 81.818 |
| 6.0 | 70.707 |
| 6.0 | 73.737 |
| 6.0 | 68.687 |
| 6.0 | 84.848 |
| 6.0 | 83.838 |
| 6.0 | 81.818 |
| 6.0 | 82.828 |
| 6.0 | 85.859 |
| 6.0 | 81.818 |
| 6.0 | 80.808 |
| 6.0 | 79.798 |
| 6.0 | 76.768 |
| 6.0 | 75.758 |
| 6.0 | 89.899 |
| 6.0 | 88.889 |
| 6.0 | 86.869 |
| 6.0 | 85.859 |
| 6.0 | 83.838 |
| 6.0 | 81.818 |
| 6.0 | 84.848 |
| 6.0 | 87.879 |
| 6.0 | 79.798 |
| 6.0 | 75.758 |
| 6.0 | 88.889 |
| 6.0 | 78.788 |
| 6.0 | 79.798 |
| 6.0 | 77.778 |
| 6.0 | 83.838 |
| 6.0 | 85.859 |
| 6.0 | 83.838 |
| 6.0 | 77.778 |
| 6.0 | 76.768 |
| 6.0 | 76.768 |
| 6.0 | 77.778 |
| 6.0 | 73.737 |
| 6.0 | 72.727 |
| 6.0 | 74.747 |
| 6.0 | 74.747 |
| 6.0 | 76.768 |
| 6.0 | 73.737 |
| 6.0 | 76.768 |
| 6.0 | 74.747 |
| 6.0 | 73.737 |
| 6.0 | 81.818 |
| 6.0 | 85.859 |
| 6.0 | 82.828 |
| 6.0 | 75.758 |
| 6.0 | 78.788 |
| 6.0 | 77.778 |
| 6.0 | 81.818 |
| 6.0 | 79.798 |
| 6.0 | 81.818 |
| 6.0 | 72.727 |
| 6.0 | 74.747 |
| 6.0 | 76.768 |
| 6.0 | 72.727 |
| 6.0 | 69.697 |
| 6.0 | 71.717 |
| 6.0 | 84.848 |
| 6.0 | 78.788 |
| 6.0 | 74.747 |
| 6.0 | 76.768 |
| 6.0 | 80.808 |
| 6.0 | 75.758 |
| 6.0 | 79.798 |
| 6.0 | 63.636 |
| 6.0 | 65.657 |
| 6.0 | 63.636 |
| 6.0 | 88.889 |
| 6.0 | 83.838 |
| 6.0 | 85.859 |
| 6.0 | 67.677 |
| 6.0 | 66.667 |
| 6.0 | 67.677 |
| 6.0 | 75.758 |
| 6.0 | 80.808 |
| 6.0 | 75.758 |
| 6.0 | 67.677 |
| 6.0 | 84.848 |
| 6.0 | 79.798 |
| 6.0 | 80.808 |
| 6.0 | 80.808 |
| 6.0 | 78.788 |
| 6.0 | 79.798 |
| 6.0 | 79.798 |
| 6.0 | 84.848 |
| 6.0 | 80.808 |
| 6.0 | 65.657 |
| 6.0 | 88.889 |
| 6.0 | 88.889 |
| 6.0 | 86.869 |
| 6.0 | 74.747 |
| 6.0 | 76.768 |
| 6.0 | 83.838 |
| 6.0 | 84.848 |
| 6.0 | 81.818 |
| 6.0 | 74.747 |
| 6.0 | 74.747 |
| 6.0 | 77.778 |
| 6.0 | 85.859 |
| 6.0 | 82.828 |
| 6.0 | 82.828 |
| 6.0 | 77.778 |
| 6.0 | 72.727 |
| 6.0 | 73.737 |
| 6.0 | 73.737 |
| 6.0 | 69.697 |
| 6.0 | 72.727 |
| 6.0 | 84.848 |
| 6.0 | 84.848 |
| 6.0 | 84.848 |
| 6.0 | 73.737 |
| 6.0 | 83.838 |
| 6.0 | 73.737 |
| 7.0 | 76.768 |
| 7.0 | 68.687 |
| 7.0 | 69.697 |
| 7.0 | 65.657 |
| 7.0 | 70.707 |
| 7.0 | 61.616 |
| 7.0 | 65.657 |
| 7.0 | 64.646 |
| 7.0 | 68.687 |
| 7.0 | 67.677 |
| 7.0 | 74.747 |
| 7.0 | 77.778 |
| 7.0 | 77.778 |
| 7.0 | 74.747 |
| 7.0 | 74.747 |
| 7.0 | 68.687 |
| 7.0 | 71.717 |
| 7.0 | 70.707 |
| 7.0 | 68.687 |
| 7.0 | 70.707 |
| 7.0 | 70.707 |
| 7.0 | 68.687 |
| 7.0 | 80.808 |
| 7.0 | 67.677 |
| 7.0 | 70.707 |
| 7.0 | 68.687 |
| 7.0 | 76.768 |
| 7.0 | 67.677 |
| 7.0 | 67.677 |
| 7.0 | 67.677 |
| 7.0 | 73.737 |
| 7.0 | 73.737 |
| 7.0 | 72.727 |
| 7.0 | 65.657 |
| 7.0 | 65.657 |
| 7.0 | 65.657 |
| 7.0 | 75.758 |
| 7.0 | 78.788 |
| 7.0 | 86.869 |
| 7.0 | 80.808 |
| 7.0 | 81.818 |
| 7.0 | 76.768 |
| 7.0 | 73.737 |
| 7.0 | 72.727 |
| 7.0 | 75.758 |
| 7.0 | 75.758 |
| 7.0 | 69.697 |
| 7.0 | 71.717 |
| 7.0 | 71.717 |
| 7.0 | 72.727 |
| 7.0 | 81.818 |
| 7.0 | 74.747 |
| 7.0 | 76.768 |
| 7.0 | 74.747 |
| 7.0 | 79.798 |
| 7.0 | 68.687 |
| 7.0 | 70.707 |
| 7.0 | 69.697 |
| 7.0 | 74.747 |
| 7.0 | 77.778 |
| 7.0 | 75.758 |
| 7.0 | 67.677 |
| 7.0 | 66.667 |
| 7.0 | 68.687 |
| 7.0 | 66.667 |
| 7.0 | 69.697 |
| 7.0 | 77.778 |
| 7.0 | 74.747 |
| 7.0 | 71.717 |
| 7.0 | 73.737 |
| 7.0 | 78.788 |
| 7.0 | 76.768 |
| 7.0 | 71.717 |
| 7.0 | 66.667 |
| 7.0 | 66.667 |
| 7.0 | 83.838 |
| 7.0 | 78.788 |
| 7.0 | 73.737 |
| 7.0 | 75.758 |
| 7.0 | 82.828 |
| 7.0 | 78.788 |
| 7.0 | 80.808 |
| 7.0 | 78.788 |
| 7.0 | 79.798 |
| 7.0 | 73.737 |
| 7.0 | 70.707 |
| 7.0 | 83.838 |
| 7.0 | 77.778 |
| 7.0 | 76.768 |
| 7.0 | 76.768 |
| 7.0 | 74.747 |
| 7.0 | 70.707 |
| 7.0 | 71.717 |
| 7.0 | 73.737 |
| 7.0 | 70.707 |
| 7.0 | 74.747 |
| 7.0 | 73.737 |
| 7.0 | 70.707 |
| 7.0 | 70.707 |
| 7.0 | 71.717 |
| 7.0 | 79.798 |
| 7.0 | 70.707 |
| 7.0 | 71.717 |
| 7.0 | 71.717 |
| 7.0 | 79.798 |
| 7.0 | 81.818 |
| 7.0 | 77.778 |
| 7.0 | 70.707 |
| 7.0 | 71.717 |
| 7.0 | 70.707 |
| 7.0 | 77.778 |
| 7.0 | 77.778 |
| 7.0 | 77.778 |
| 7.0 | 67.677 |
| 7.0 | 66.667 |
| 7.0 | 67.677 |
| 7.0 | 76.768 |
| 7.0 | 75.758 |
| 7.0 | 77.778 |
| 7.0 | 65.657 |
| 7.0 | 73.737 |
| 7.0 | 71.717 |
| 7.0 | 86.869 |
| 7.0 | 85.859 |
| 7.0 | 83.838 |
| 7.0 | 78.788 |
| 7.0 | 79.798 |
| 7.0 | 72.727 |
| 7.0 | 70.707 |
| 7.0 | 75.758 |
| 7.0 | 63.636 |
| 7.0 | 68.687 |
| 7.0 | 61.616 |
| 7.0 | 72.727 |
| 7.0 | 83.838 |
| 7.0 | 75.758 |
| 7.0 | 75.758 |
| 7.0 | 75.758 |
| 7.0 | 72.727 |
| 7.0 | 63.636 |
| 7.0 | 66.667 |
| 7.0 | 64.646 |
| 7.0 | 75.758 |
| 7.0 | 73.737 |
| 7.0 | 74.747 |
| 7.0 | 67.677 |
| 7.0 | 65.657 |
| 7.0 | 66.667 |
| 7.0 | 67.677 |
| 7.0 | 68.687 |
| 7.0 | 80.808 |
| 7.0 | 72.727 |
| 7.0 | 67.677 |
| 7.0 | 70.707 |
| 7.0 | 81.818 |
| 7.0 | 81.818 |
| 7.0 | 68.687 |
| 7.0 | 68.687 |
| 7.0 | 68.687 |
| 7.0 | 89.899 |
| 7.0 | 78.788 |
| 7.0 | 71.717 |
| 7.0 | 76.768 |
| 7.0 | 90.909 |
| 7.0 | 82.828 |
| 7.0 | 85.859 |
| 7.0 | 74.747 |
| 7.0 | 77.778 |
| 7.0 | 69.697 |
| 7.0 | 73.737 |
| 7.0 | 86.869 |
| 7.0 | 71.717 |
| 7.0 | 72.727 |
| 7.0 | 73.737 |
| 7.0 | 75.758 |
| 7.0 | 70.707 |
| 7.0 | 67.677 |
| 7.0 | 70.707 |
| 7.0 | 72.727 |
| 7.0 | 75.758 |
| 7.0 | 72.727 |
| 7.0 | 67.677 |
| 7.0 | 65.657 |
| 7.0 | 67.677 |
| 7.0 | 85.859 |
| 7.0 | 71.717 |
| 7.0 | 71.717 |
| 7.0 | 72.727 |
| 7.0 | 85.859 |
| 7.0 | 82.828 |
| 7.0 | 82.828 |
| 7.0 | 73.737 |
| 7.0 | 75.758 |
| 7.0 | 76.768 |
| 7.0 | 77.778 |
| 7.0 | 77.778 |
| 7.0 | 76.768 |
| 7.0 | 64.646 |
| 7.0 | 65.657 |
| 7.0 | 65.657 |
| 7.0 | 74.747 |
| 7.0 | 73.737 |
| 7.0 | 72.727 |
| 7.0 | 64.646 |
| 7.0 | 74.747 |
| 7.0 | 82.828 |
| 7.0 | 86.869 |
| 7.0 | 76.768 |
| 7.0 | 72.727 |
| 7.0 | 75.758 |
| 7.0 | 80.808 |
| 7.0 | 83.838 |
| 7.0 | 78.788 |
| 7.0 | 75.758 |
| 7.0 | 75.758 |
| 7.0 | 87.879 |
| 7.0 | 87.879 |
| 7.0 | 87.879 |
| 7.0 | 85.859 |
| 7.0 | 88.889 |
| 7.0 | 82.828 |
| 7.0 | 85.859 |
| 7.0 | 82.828 |
| 7.0 | 80.808 |
| 7.0 | 78.788 |
| 7.0 | 79.798 |
| 7.0 | 85.859 |
| 7.0 | 74.747 |
| 7.0 | 76.768 |
| 7.0 | 75.758 |
| 7.0 | 82.828 |
| 7.0 | 72.727 |
| 7.0 | 73.737 |
| 7.0 | 70.707 |
| 7.0 | 78.788 |
| 7.0 | 78.788 |
| 7.0 | 78.788 |
| 7.0 | 70.707 |
| 7.0 | 68.687 |
| 7.0 | 71.717 |
| 7.0 | 84.848 |
| 7.0 | 78.788 |
| 7.0 | 77.778 |
| 7.0 | 77.778 |
| 7.0 | 82.828 |
| 7.0 | 82.828 |
| 7.0 | 82.828 |
| 7.0 | 74.747 |
| 7.0 | 75.758 |
| 7.0 | 77.778 |
| 7.0 | 81.818 |
| 7.0 | 76.768 |
| 7.0 | 76.768 |
| 7.0 | 68.687 |
| 7.0 | 69.697 |
| 7.0 | 70.707 |
| 7.0 | 75.758 |
| 7.0 | 77.778 |
| 7.0 | 78.788 |
| 7.0 | 68.687 |
| 7.0 | 78.788 |
| 7.0 | 78.788 |
| 7.0 | 69.697 |
| 7.0 | 66.667 |
| 7.0 | 68.687 |
| 7.0 | 84.848 |
| 7.0 | 73.737 |
| 7.0 | 70.707 |
| 7.0 | 70.707 |
| 7.0 | 85.859 |
| 7.0 | 77.778 |
| 7.0 | 80.808 |
| 7.0 | 74.747 |
| 7.0 | 72.727 |
| 7.0 | 71.717 |
| 7.0 | 84.848 |
| 7.0 | 83.838 |
| 7.0 | 81.818 |
| 7.0 | 79.798 |
| 7.0 | 81.818 |
| 7.0 | 81.818 |
| 7.0 | 82.828 |
| 7.0 | 68.687 |
| 7.0 | 68.687 |
| 7.0 | 66.667 |
| 7.0 | 90.909 |
| 7.0 | 87.879 |
| 7.0 | 89.899 |
| 7.0 | 78.788 |
| 7.0 | 81.818 |
| 7.0 | 75.758 |
| 7.0 | 85.859 |
| 7.0 | 90.909 |
| 7.0 | 82.828 |
| 7.0 | 76.768 |
| 7.0 | 84.848 |
| 7.0 | 72.727 |
| 7.0 | 77.778 |
| 7.0 | 74.747 |
| 7.0 | 81.818 |
| 7.0 | 84.848 |
| 7.0 | 81.818 |
| 7.0 | 74.747 |
| 7.0 | 72.727 |
| 7.0 | 73.737 |
| 7.0 | 77.778 |
| 7.0 | 76.768 |
| 7.0 | 74.747 |
| 7.0 | 69.697 |
| 7.0 | 70.707 |
| 7.0 | 69.697 |
| 7.0 | 76.768 |
| 7.0 | 74.747 |
| 7.0 | 76.768 |
| 7.0 | 66.667 |
| 7.0 | 84.848 |
| 7.0 | 84.848 |
| 7.0 | 83.838 |
| 7.0 | 73.737 |
| 7.0 | 72.727 |
| 7.0 | 76.768 |
| 7.0 | 84.848 |
| 7.0 | 82.828 |
| 7.0 | 81.818 |
| 7.0 | 74.747 |
| 7.0 | 76.768 |
| 7.0 | 75.758 |
| 7.0 | 77.778 |
| 7.0 | 65.657 |
| 7.0 | 76.768 |
| 8.0 | 64.646 |
| 8.0 | 78.788 |
| 8.0 | 67.677 |
| 8.0 | 68.687 |
| 8.0 | 67.677 |
| 8.0 | 75.758 |
| 8.0 | 68.687 |
| 8.0 | 69.697 |
| 8.0 | 67.677 |
| 8.0 | 81.818 |
| 8.0 | 67.677 |
| 8.0 | 76.768 |
| 8.0 | 69.697 |
| 8.0 | 79.798 |
| 8.0 | 67.677 |
| 8.0 | 68.687 |
| 8.0 | 67.677 |
| 8.0 | 75.758 |
| 8.0 | 74.747 |
| 8.0 | 81.818 |
| 8.0 | 81.818 |
| 8.0 | 83.838 |
| 8.0 | 81.818 |
| 8.0 | 76.768 |
| 8.0 | 70.707 |
| 8.0 | 73.737 |
| 8.0 | 75.758 |
| 8.0 | 69.697 |
| 8.0 | 70.707 |
| 8.0 | 68.687 |
| 8.0 | 72.727 |
| 8.0 | 79.798 |
| 8.0 | 70.707 |
| 8.0 | 74.747 |
| 8.0 | 73.737 |
| 8.0 | 77.778 |
| 8.0 | 69.697 |
| 8.0 | 70.707 |
| 8.0 | 69.697 |
| 8.0 | 78.788 |
| 8.0 | 78.788 |
| 8.0 | 77.778 |
| 8.0 | 70.707 |
| 8.0 | 68.687 |
| 8.0 | 70.707 |
| 8.0 | 85.859 |
| 8.0 | 64.646 |
| 8.0 | 74.747 |
| 8.0 | 66.667 |
| 8.0 | 74.747 |
| 8.0 | 66.667 |
| 8.0 | 68.687 |
| 8.0 | 67.677 |
| 8.0 | 73.737 |
| 8.0 | 70.707 |
| 8.0 | 80.808 |
| 8.0 | 87.879 |
| 8.0 | 85.859 |
| 8.0 | 77.778 |
| 8.0 | 78.788 |
| 8.0 | 69.697 |
| 8.0 | 71.717 |
| 8.0 | 75.758 |
| 8.0 | 66.667 |
| 8.0 | 66.667 |
| 8.0 | 67.677 |
| 8.0 | 73.737 |
| 8.0 | 82.828 |
| 8.0 | 74.747 |
| 8.0 | 76.768 |
| 8.0 | 75.758 |
| 8.0 | 78.788 |
| 8.0 | 66.667 |
| 8.0 | 67.677 |
| 8.0 | 67.677 |
| 8.0 | 75.758 |
| 8.0 | 76.768 |
| 8.0 | 75.758 |
| 8.0 | 66.667 |
| 8.0 | 66.667 |
| 8.0 | 67.677 |
| 8.0 | 78.788 |
| 8.0 | 76.768 |
| 8.0 | 89.899 |
| 8.0 | 87.879 |
| 8.0 | 85.859 |
| 8.0 | 83.838 |
| 8.0 | 83.838 |
| 8.0 | 73.737 |
| 8.0 | 70.707 |
| 8.0 | 79.798 |
| 8.0 | 64.646 |
| 8.0 | 68.687 |
| 8.0 | 67.677 |
| 8.0 | 78.788 |
| 8.0 | 83.838 |
| 8.0 | 77.778 |
| 8.0 | 79.798 |
| 8.0 | 78.788 |
| 8.0 | 81.818 |
| 8.0 | 70.707 |
| 8.0 | 70.707 |
| 8.0 | 71.717 |
| 8.0 | 79.798 |
| 8.0 | 79.798 |
| 8.0 | 80.808 |
| 8.0 | 70.707 |
| 8.0 | 69.697 |
| 8.0 | 70.707 |
| 8.0 | 70.707 |
| 8.0 | 76.768 |
| 8.0 | 86.869 |
| 8.0 | 80.808 |
| 8.0 | 74.747 |
| 8.0 | 75.758 |
| 8.0 | 81.818 |
| 8.0 | 82.828 |
| 8.0 | 73.737 |
| 8.0 | 70.707 |
| 8.0 | 73.737 |
| 8.0 | 89.899 |
| 8.0 | 86.869 |
| 8.0 | 80.808 |
| 8.0 | 79.798 |
| 8.0 | 93.939 |
| 8.0 | 84.848 |
| 8.0 | 89.899 |
| 8.0 | 84.848 |
| 8.0 | 85.859 |
| 8.0 | 77.778 |
| 8.0 | 72.727 |
| 8.0 | 83.838 |
| 8.0 | 70.707 |
| 8.0 | 71.717 |
| 8.0 | 73.737 |
| 8.0 | 77.778 |
| 8.0 | 67.677 |
| 8.0 | 69.697 |
| 8.0 | 70.707 |
| 8.0 | 76.768 |
| 8.0 | 77.778 |
| 8.0 | 77.778 |
| 8.0 | 67.677 |
| 8.0 | 66.667 |
| 8.0 | 67.677 |
| 8.0 | 85.859 |
| 8.0 | 74.747 |
| 8.0 | 75.758 |
| 8.0 | 74.747 |
| 8.0 | 84.848 |
| 8.0 | 83.838 |
| 8.0 | 82.828 |
| 8.0 | 75.758 |
| 8.0 | 75.758 |
| 8.0 | 78.788 |
| 8.0 | 79.798 |
| 8.0 | 79.798 |
| 8.0 | 80.808 |
| 8.0 | 67.677 |
| 8.0 | 67.677 |
| 8.0 | 69.697 |
| 8.0 | 78.788 |
| 8.0 | 77.778 |
| 8.0 | 79.798 |
| 8.0 | 67.677 |
| 9.0 | 67.677 |
| 9.0 | 72.727 |
| 9.0 | 82.828 |
| 9.0 | 67.677 |
| 9.0 | 74.747 |
| 9.0 | 71.717 |
| 9.0 | 78.788 |
| 9.0 | 71.717 |
| 9.0 | 71.717 |
| 9.0 | 70.707 |
| 9.0 | 67.677 |
| 9.0 | 84.848 |
| 9.0 | 65.657 |
| 9.0 | 74.747 |
| 9.0 | 70.707 |
| 9.0 | 75.758 |
| 9.0 | 68.687 |
| 9.0 | 68.687 |
| 9.0 | 69.697 |
| 9.0 | 87.879 |
| 9.0 | 70.707 |
| 9.0 | 79.798 |
| 9.0 | 75.758 |
| 9.0 | 80.808 |
| 9.0 | 72.727 |
| 9.0 | 72.727 |
| 9.0 | 73.737 |
| 9.0 | 79.798 |
| 9.0 | 74.747 |
| 9.0 | 87.879 |
| 9.0 | 89.899 |
| 9.0 | 87.879 |
| 9.0 | 84.848 |
| 9.0 | 82.828 |
| 9.0 | 71.717 |
| 9.0 | 69.697 |
| 9.0 | 79.798 |
| 9.0 | 69.697 |
| 9.0 | 68.687 |
| 9.0 | 69.697 |
| 9.0 | 77.778 |
| 9.0 | 83.838 |
| 9.0 | 75.758 |
| 9.0 | 79.798 |
| 9.0 | 77.778 |
| 9.0 | 80.808 |
| 9.0 | 70.707 |
| 9.0 | 71.717 |
| 9.0 | 71.717 |
| 9.0 | 79.798 |
| 9.0 | 81.818 |
| 9.0 | 78.788 |
| 9.0 | 71.717 |
| 9.0 | 71.717 |
| 9.0 | 71.717 |
| 10.0 | 71.717 |
| 10.0 | 69.697 |
| 10.0 | 77.778 |
| 10.0 | 85.859 |
| 10.0 | 72.727 |
| 10.0 | 78.788 |
| 10.0 | 73.737 |
| 10.0 | 79.798 |
| 10.0 | 71.717 |
| 10.0 | 72.727 |
| 10.0 | 71.717 |
| 11.0 | 73.737 |